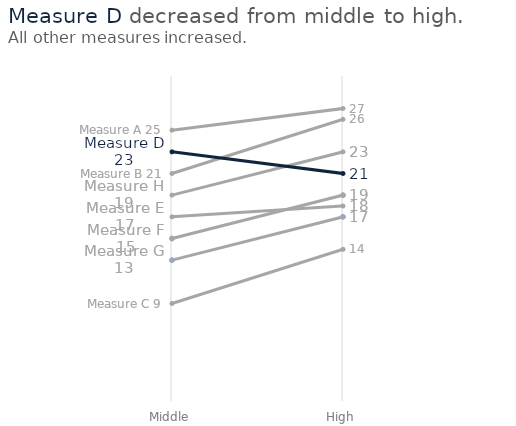
| Category | Measure A | Measure B | Measure C | Measure E | Measure F | Measure G | Measure H | Measure D |
|---|---|---|---|---|---|---|---|---|
| Middle | 25 | 21 | 9 | 17 | 15 | 13 | 19 | 23 |
| High | 27 | 26 | 14 | 18 | 19 | 17 | 23 | 21 |